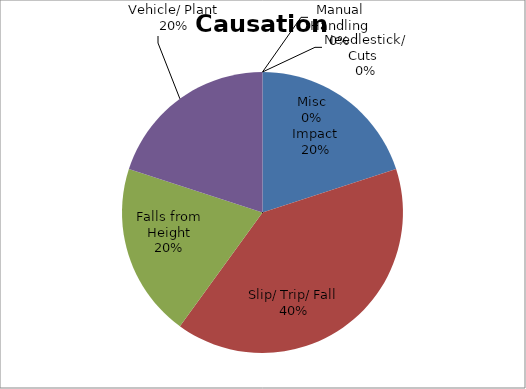
| Category | Series 0 |
|---|---|
| Impact | 0.2 |
| Slip/ Trip/ Fall | 0.4 |
| Falls from Height | 0.2 |
| Vehicle/ Plant | 0.2 |
| Manual Handling | 0 |
| Needlestick/ Cuts  | 0 |
| Misc | 0 |